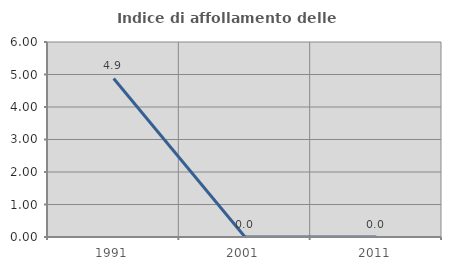
| Category | Indice di affollamento delle abitazioni  |
|---|---|
| 1991.0 | 4.878 |
| 2001.0 | 0 |
| 2011.0 | 0 |